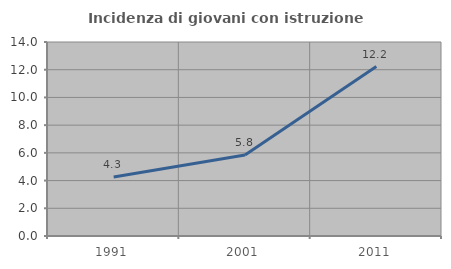
| Category | Incidenza di giovani con istruzione universitaria |
|---|---|
| 1991.0 | 4.26 |
| 2001.0 | 5.841 |
| 2011.0 | 12.224 |